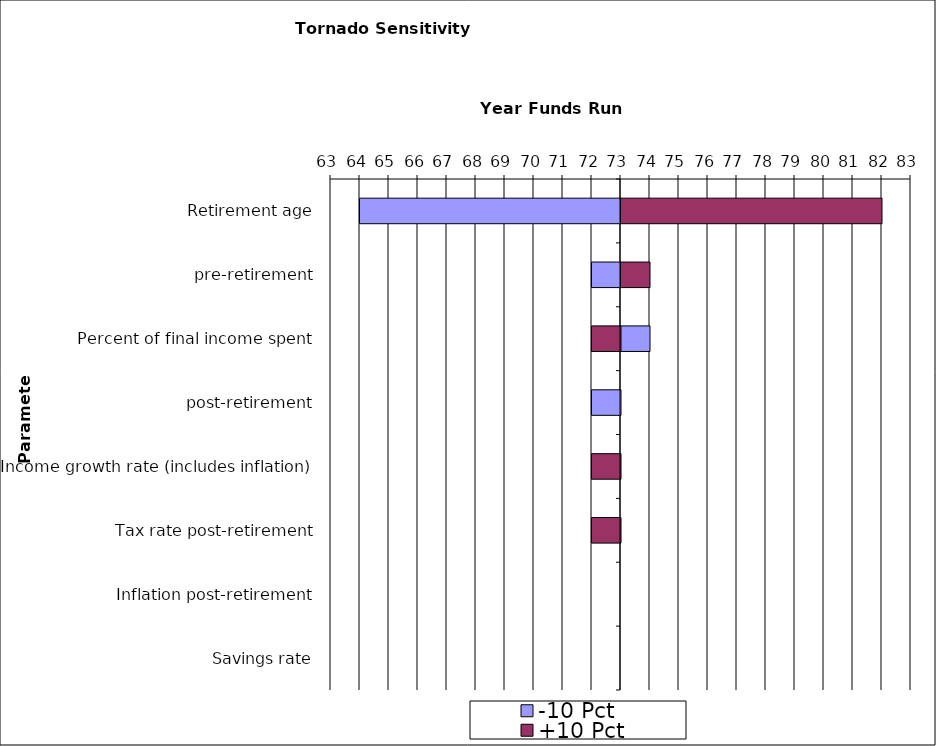
| Category | -10 Pct | +10 Pct |
|---|---|---|
| Retirement age | 64 | 82 |
|    pre-retirement | 72 | 74 |
| Percent of final income spent | 74 | 72 |
|    post-retirement | 72 | 73 |
| Income growth rate (includes inflation) | 73 | 72 |
| Tax rate post-retirement | 73 | 72 |
| Inflation post-retirement | 73 | 73 |
| Savings rate | 73 | 73 |